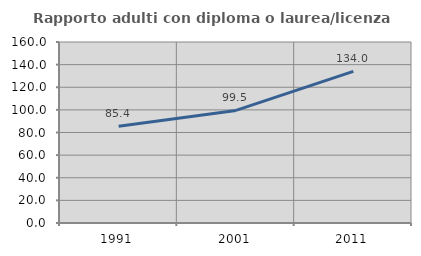
| Category | Rapporto adulti con diploma o laurea/licenza media  |
|---|---|
| 1991.0 | 85.445 |
| 2001.0 | 99.508 |
| 2011.0 | 133.982 |